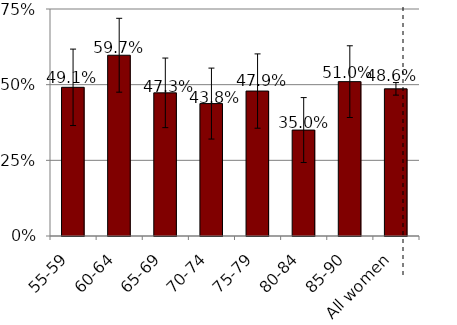
| Category | Series 0 |
|---|---|
| 55-59 | 0.491 |
| 60-64 | 0.597 |
| 65-69 | 0.473 |
| 70-74 | 0.438 |
| 75-79 | 0.479 |
| 80-84 | 0.35 |
| 85-90 | 0.51 |
| All women | 0.486 |